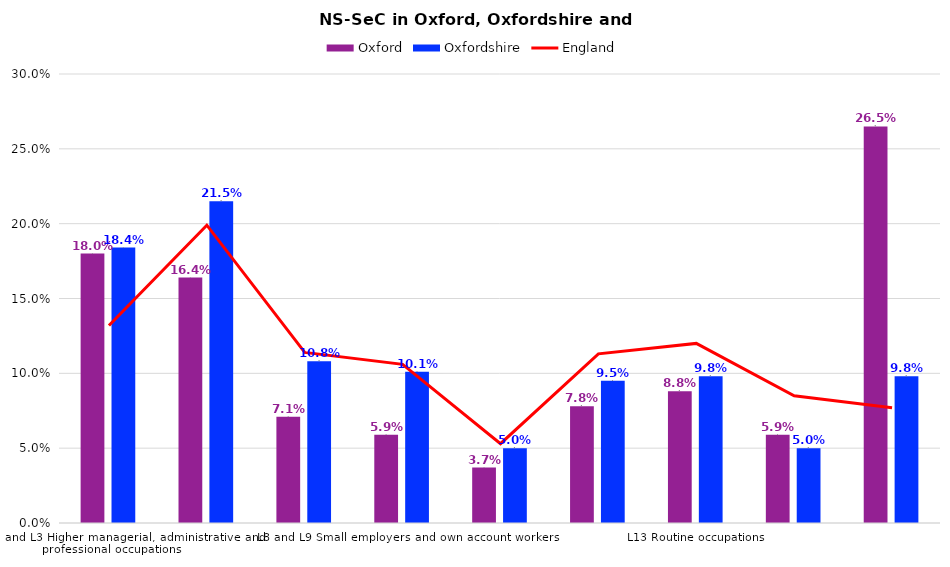
| Category | Oxford | Oxfordshire |
|---|---|---|
| L1, L2 and L3 Higher managerial, administrative and professional occupations | 0.18 | 0.184 |
| L4, L5 and L6 Lower managerial, administrative and professional occupations | 0.164 | 0.215 |
| L7 Intermediate occupations | 0.071 | 0.108 |
| L8 and L9 Small employers and own account workers | 0.059 | 0.101 |
| L10 and L11 Lower supervisory and technical occupations | 0.037 | 0.05 |
| L12 Semi-routine occupations | 0.078 | 0.095 |
| L13 Routine occupations | 0.088 | 0.098 |
| L14.1 and L14.2 Never worked and long-term unemployed | 0.059 | 0.05 |
| L15 Full-time students | 0.265 | 0.098 |